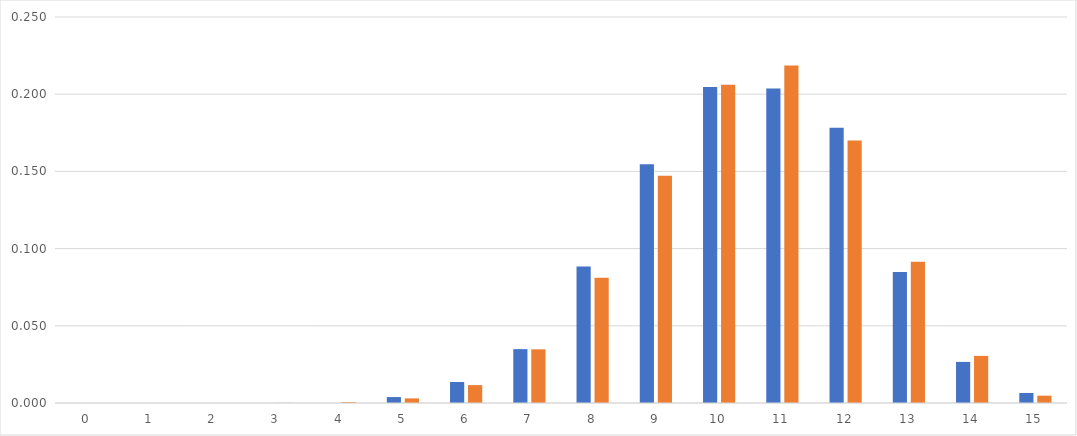
| Category | rel freq | prob |
|---|---|---|
| 0.0 | 0 | 0 |
| 1.0 | 0 | 0 |
| 2.0 | 0 | 0 |
| 3.0 | 0 | 0 |
| 4.0 | 0 | 0.001 |
| 5.0 | 0.004 | 0.003 |
| 6.0 | 0.014 | 0.012 |
| 7.0 | 0.035 | 0.035 |
| 8.0 | 0.088 | 0.081 |
| 9.0 | 0.155 | 0.147 |
| 10.0 | 0.205 | 0.206 |
| 11.0 | 0.204 | 0.219 |
| 12.0 | 0.178 | 0.17 |
| 13.0 | 0.085 | 0.092 |
| 14.0 | 0.027 | 0.031 |
| 15.0 | 0.007 | 0.005 |